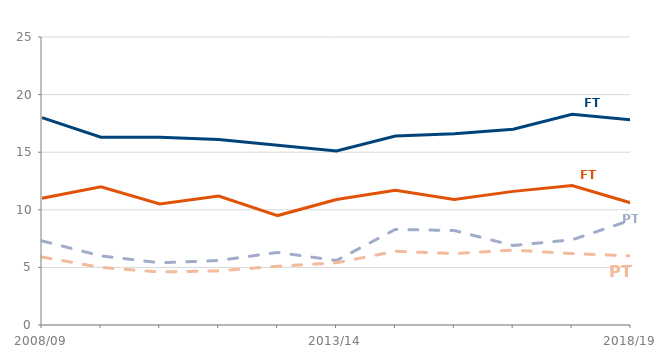
| Category | FT Males | FT Females | PT Males | PT Females |
|---|---|---|---|---|
| 2008/09 | 18000 | 11000 | 7300 | 5900 |
| 2009/10 | 16300 | 12000 | 6000 | 5000 |
| 2010/11 | 16300 | 10500 | 5400 | 4600 |
| 2011/12 | 16100 | 11200 | 5600 | 4700 |
| 2012/13 | 15600 | 9500 | 6300 | 5100 |
| 2013/14 | 15100 | 10900 | 5600 | 5400 |
| 2014/15 | 16400 | 11700 | 8300 | 6400 |
| 2015/16 | 16600 | 10900 | 8200 | 6200 |
| 2016/17 | 17000 | 11600 | 6900 | 6500 |
| 2017/18 | 18300 | 12100 | 7400 | 6200 |
| 2018/19 | 17800 | 10600 | 9100 | 6000 |